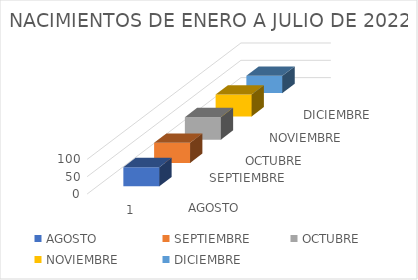
| Category | AGOSTO | SEPTIEMBRE | OCTUBRE  | NOVIEMBRE | DICIEMBRE |
|---|---|---|---|---|---|
| 0 | 55 | 58 | 65 | 63 | 50 |